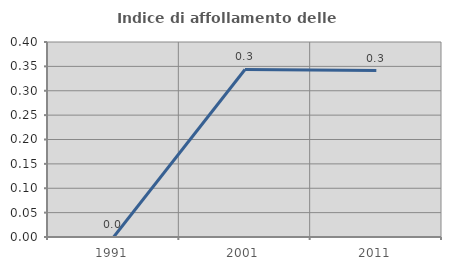
| Category | Indice di affollamento delle abitazioni  |
|---|---|
| 1991.0 | 0 |
| 2001.0 | 0.344 |
| 2011.0 | 0.341 |